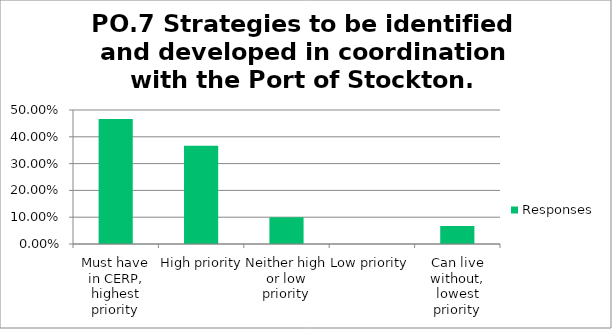
| Category | Responses |
|---|---|
| Must have in CERP, highest priority | 0.467 |
| High priority | 0.367 |
| Neither high or low priority | 0.1 |
| Low priority | 0 |
| Can live without, lowest priority | 0.067 |